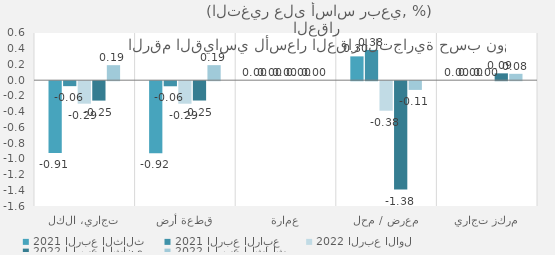
| Category | 2021 | 2022 |
|---|---|---|
| تجاري، الكل | -0.063 | 0.191 |
| قطعة أرض | -0.065 | 0.191 |
| عمارة | 0 | 0 |
| معرض / محل | 0.385 | -0.111 |
| مركز تجاري | 0 | 0.081 |